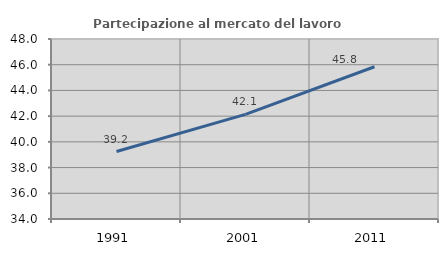
| Category | Partecipazione al mercato del lavoro  femminile |
|---|---|
| 1991.0 | 39.248 |
| 2001.0 | 42.135 |
| 2011.0 | 45.844 |